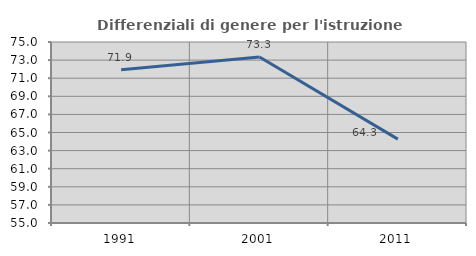
| Category | Differenziali di genere per l'istruzione superiore |
|---|---|
| 1991.0 | 71.939 |
| 2001.0 | 73.333 |
| 2011.0 | 64.268 |